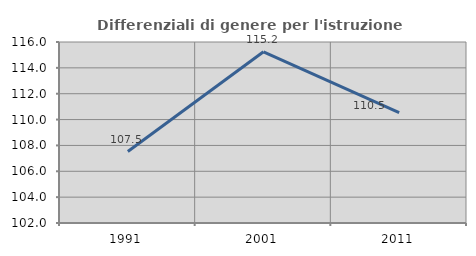
| Category | Differenziali di genere per l'istruzione superiore |
|---|---|
| 1991.0 | 107.528 |
| 2001.0 | 115.24 |
| 2011.0 | 110.534 |